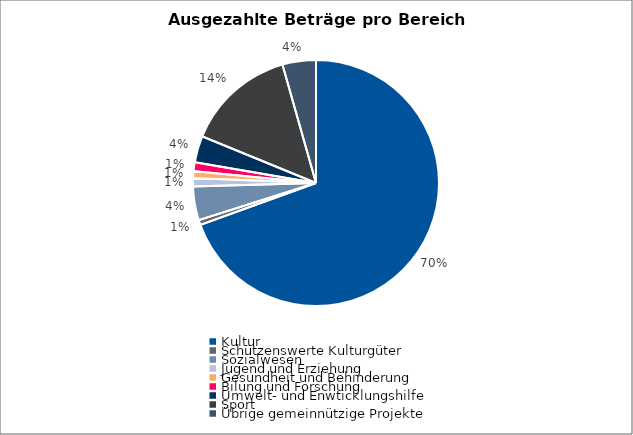
| Category | Series 0 |
|---|---|
| Kultur | 2140199 |
| Schützenswerte Kulturgüter | 20000 |
| Sozialwesen | 136269 |
| Jugend und Erziehung | 33846 |
| Gesundheit und Behinderung | 27700 |
| Bilung und Forschung | 36000 |
| Umwelt- und Enwticklungshilfe | 107300 |
| Sport | 444135 |
| Übrige gemeinnützige Projekte | 135353 |